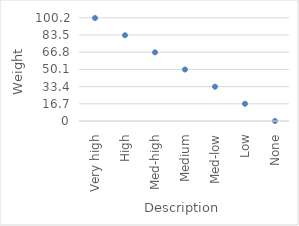
| Category | Series 0 |
|---|---|
| Very high | 100 |
| High | 83.3 |
| Med-high | 66.7 |
| Medium | 50 |
| Med-low | 33.3 |
| Low | 16.7 |
| None | 0 |